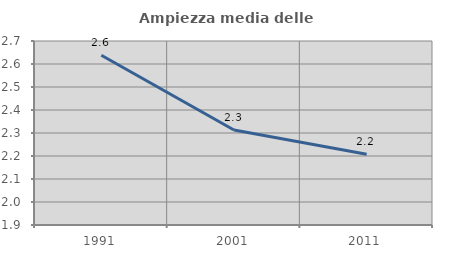
| Category | Ampiezza media delle famiglie |
|---|---|
| 1991.0 | 2.638 |
| 2001.0 | 2.313 |
| 2011.0 | 2.208 |